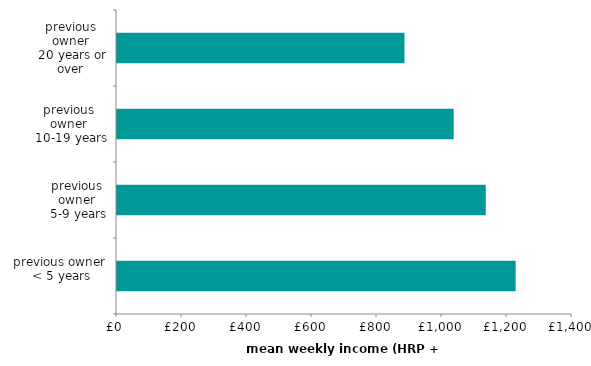
| Category | Mean weekly income (HRP + partner) |
|---|---|
| previous owner 
< 5 years | 1226.622 |
| previous owner
 5-9 years | 1134.709 |
| previous owner
 10-19 years | 1035.967 |
| previous owner
 20 years or over | 884.469 |